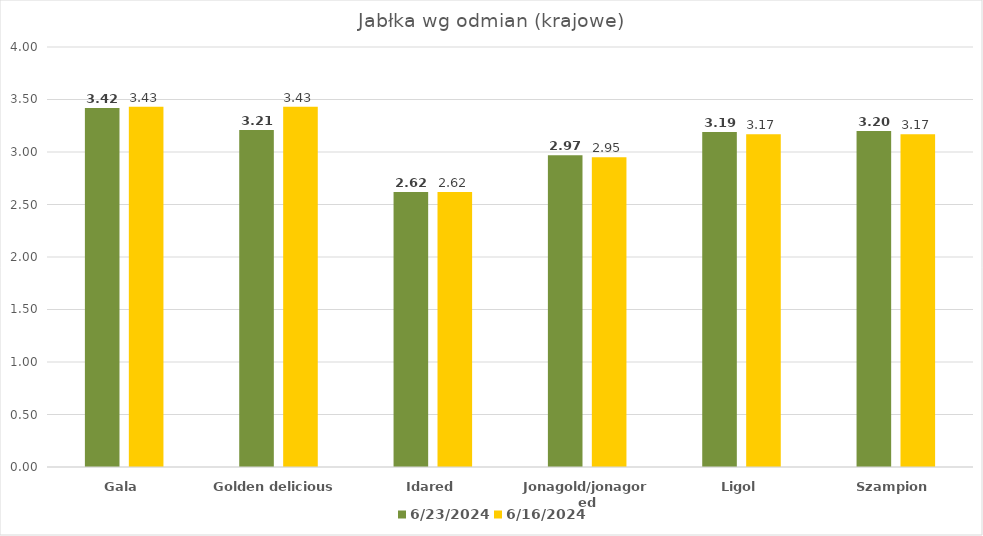
| Category | 2024-06-23 | 2024-06-16 |
|---|---|---|
| Gala | 3.42 | 3.43 |
| Golden delicious | 3.21 | 3.43 |
| Idared | 2.62 | 2.62 |
| Jonagold/jonagored | 2.97 | 2.95 |
| Ligol | 3.19 | 3.17 |
| Szampion | 3.2 | 3.17 |